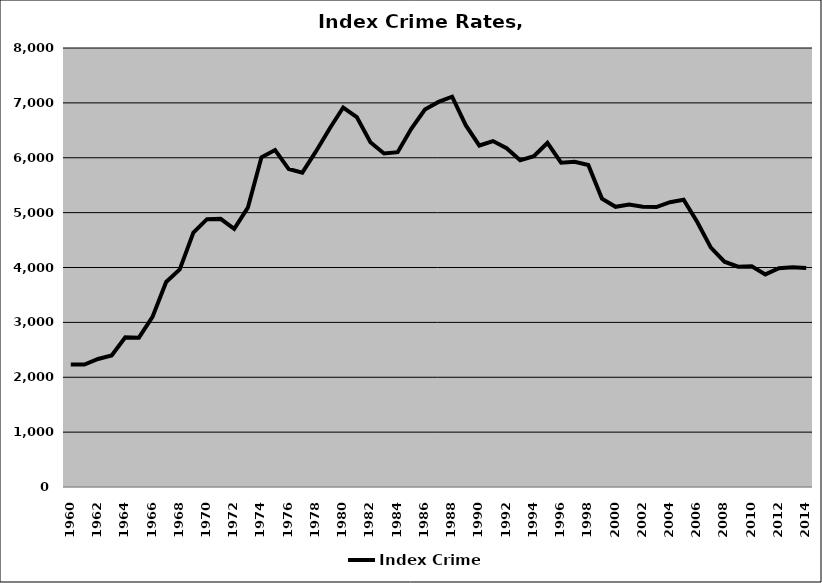
| Category | Index Crime |
|---|---|
| 1960.0 | 2232.149 |
| 1961.0 | 2231.289 |
| 1962.0 | 2333.699 |
| 1963.0 | 2396.23 |
| 1964.0 | 2729.122 |
| 1965.0 | 2721.304 |
| 1966.0 | 3099.228 |
| 1967.0 | 3736.735 |
| 1968.0 | 3964.957 |
| 1969.0 | 4635.832 |
| 1970.0 | 4881.072 |
| 1971.0 | 4885.88 |
| 1972.0 | 4703.224 |
| 1973.0 | 5089.939 |
| 1974.0 | 6009.062 |
| 1975.0 | 6140.914 |
| 1976.0 | 5794.02 |
| 1977.0 | 5727.747 |
| 1978.0 | 6115.58 |
| 1979.0 | 6529.521 |
| 1980.0 | 6914.98 |
| 1981.0 | 6742.023 |
| 1982.0 | 6282.214 |
| 1983.0 | 6077.744 |
| 1984.0 | 6101.702 |
| 1985.0 | 6528.827 |
| 1986.0 | 6879.677 |
| 1987.0 | 7017.1 |
| 1988.0 | 7113.033 |
| 1989.0 | 6593.825 |
| 1990.0 | 6222.913 |
| 1991.0 | 6304.085 |
| 1992.0 | 6172.8 |
| 1993.0 | 5952.293 |
| 1994.0 | 6027.531 |
| 1995.0 | 6269.803 |
| 1996.0 | 5909.416 |
| 1997.0 | 5926.364 |
| 1998.0 | 5867.446 |
| 1999.0 | 5255.212 |
| 2000.0 | 5105.63 |
| 2001.0 | 5147.204 |
| 2002.0 | 5108.422 |
| 2003.0 | 5101.921 |
| 2004.0 | 5190.343 |
| 2005.0 | 5235.399 |
| 2006.0 | 4828.874 |
| 2007.0 | 4361.171 |
| 2008.0 | 4106.32 |
| 2009.0 | 4015.894 |
| 2010.0 | 4020.409 |
| 2011.0 | 3874.405 |
| 2012.0 | 3987.198 |
| 2013.0 | 4005.912 |
| 2014.0 | 3991.231 |